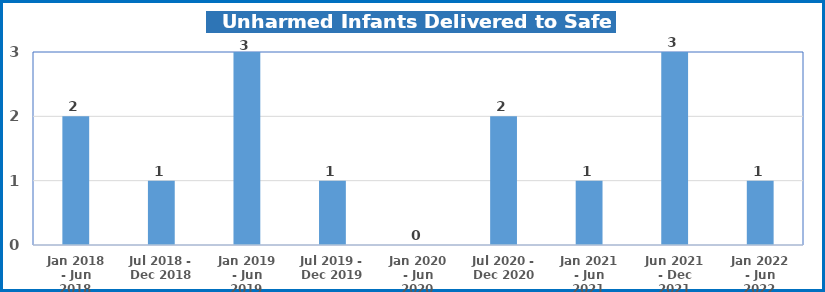
| Category | Series 0 |
|---|---|
| Jan 2018 - Jun 2018 | 2 |
| Jul 2018 - Dec 2018 | 1 |
| Jan 2019 - Jun 2019 | 3 |
| Jul 2019 - Dec 2019 | 1 |
| Jan 2020 - Jun 2020 | 0 |
| Jul 2020 - Dec 2020 | 2 |
| Jan 2021 - Jun 2021 | 1 |
| Jun 2021 - Dec 2021 | 3 |
| Jan 2022 - Jun 2022 | 1 |